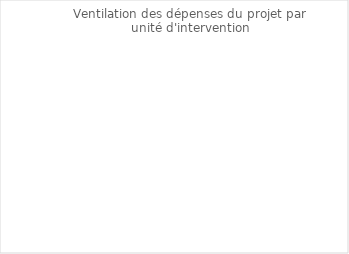
| Category | Coûts | Bénéfices |
|---|---|---|
| UI 1 | 0 | 0 |
| UI 2 | 0 | 0 |
| UI 3 | 0 | 0 |
| UI 4 | 0 | 0 |
| UI 5 | 0 | 0 |